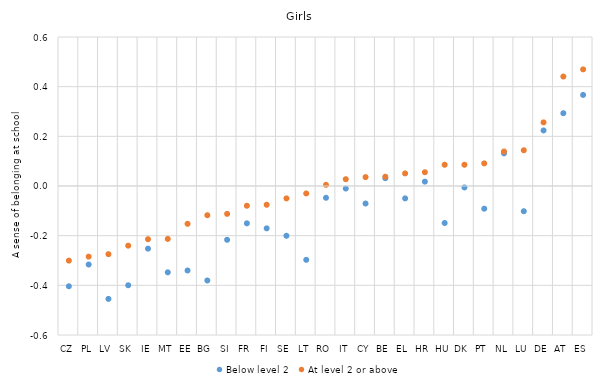
| Category | Below level 2 | At level 2 or above |
|---|---|---|
| CZ | -0.404 | -0.3 |
| PL | -0.316 | -0.284 |
| LV | -0.455 | -0.274 |
| SK | -0.4 | -0.24 |
| IE | -0.252 | -0.214 |
| MT | -0.348 | -0.213 |
| EE | -0.34 | -0.152 |
| BG | -0.38 | -0.118 |
| SI | -0.217 | -0.112 |
| FR | -0.15 | -0.079 |
| FI | -0.171 | -0.075 |
| SE | -0.2 | -0.05 |
| LT | -0.297 | -0.03 |
| RO | -0.047 | 0.005 |
| IT | -0.01 | 0.027 |
| CY | -0.071 | 0.036 |
| BE | 0.032 | 0.037 |
| EL | -0.05 | 0.051 |
| HR | 0.018 | 0.055 |
| HU | -0.149 | 0.085 |
| DK | -0.006 | 0.086 |
| PT | -0.091 | 0.091 |
| NL | 0.131 | 0.139 |
| LU | -0.102 | 0.144 |
| DE | 0.224 | 0.256 |
| AT | 0.293 | 0.441 |
| ES | 0.367 | 0.47 |